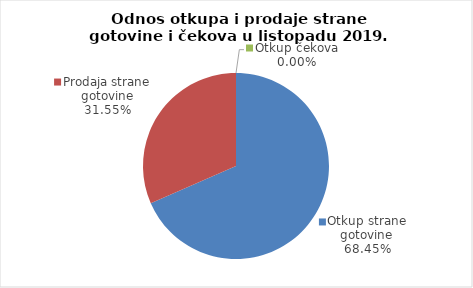
| Category | Series 0 |
|---|---|
| Otkup strane gotovine | 68.452 |
| Prodaja strane gotovine | 31.548 |
| Otkup čekova | 0 |